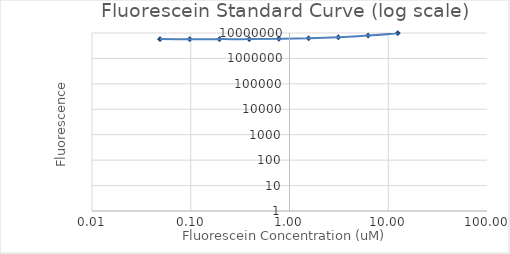
| Category | Series2 |
|---|---|
| 50.0 | 0 |
| 25.0 | 0 |
| 12.5 | 9838829.25 |
| 6.25 | 7906933.5 |
| 3.125 | 6791255.5 |
| 1.5625 | 6181341.25 |
| 0.78125 | 5901965 |
| 0.390625 | 5745324.25 |
| 0.1953125 | 5742194 |
| 0.09765625 | 5700469.75 |
| 0.048828125 | 5770810.75 |